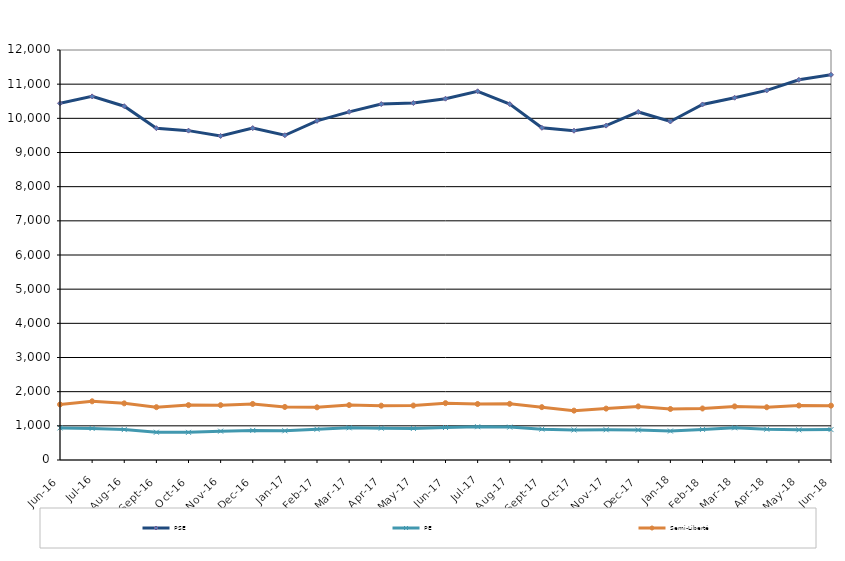
| Category | PSE | PE | Semi-Liberté |
|---|---|---|---|
| 2016-06-01 | 10441 | 939 | 1625 |
| 2016-07-01 | 10642 | 923 | 1718 |
| 2016-08-01 | 10355 | 890 | 1658 |
| 2016-09-01 | 9712 | 813 | 1546 |
| 2016-10-01 | 9640 | 809 | 1607 |
| 2016-11-01 | 9484 | 844 | 1605 |
| 2016-12-01 | 9714 | 866 | 1641 |
| 2017-01-01 | 9505 | 855 | 1553 |
| 2017-02-01 | 9927 | 900 | 1542 |
| 2017-03-01 | 10190 | 942 | 1607 |
| 2017-04-01 | 10417 | 931 | 1590 |
| 2017-05-01 | 10448 | 924 | 1594 |
| 2017-06-01 | 10575 | 951 | 1664 |
| 2017-07-01 | 10791 | 974 | 1639 |
| 2017-08-01 | 10417 | 963 | 1644 |
| 2017-09-01 | 9723 | 903 | 1547 |
| 2017-10-01 | 9637 | 879 | 1445 |
| 2017-11-01 | 9787 | 885 | 1504 |
| 2017-12-01 | 10187 | 876 | 1568 |
| 2018-01-01 | 9907 | 847 | 1493 |
| 2018-02-01 | 10406 | 895 | 1508 |
| 2018-03-01 | 10603 | 942 | 1569 |
| 2018-04-01 | 10817 | 901 | 1544 |
| 2018-05-01 | 11127 | 882 | 1594 |
| 2018-06-01 | 11275 | 890 | 1591 |